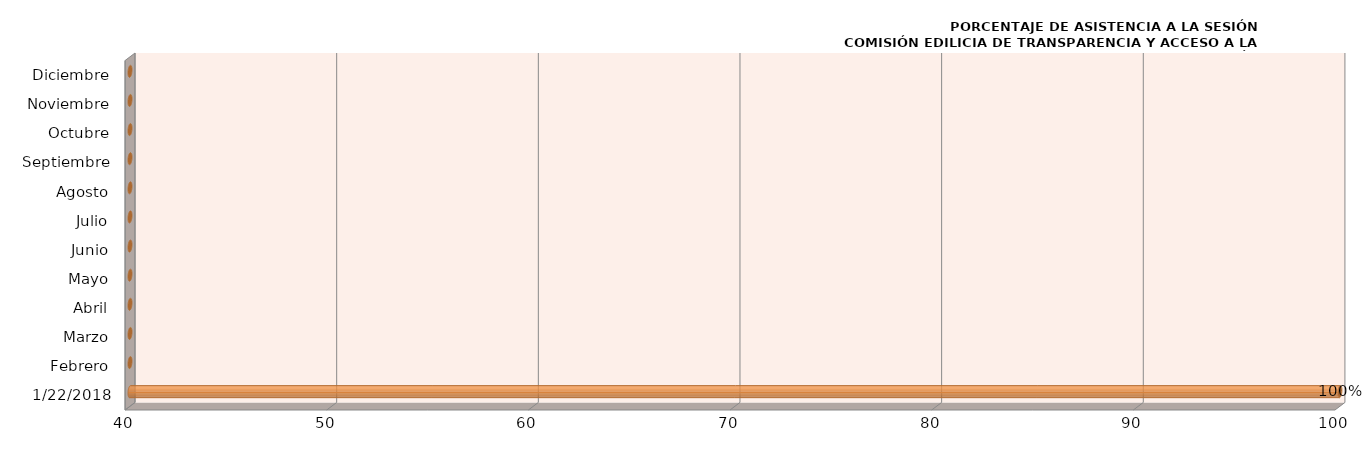
| Category | Series 0 |
|---|---|
| 22/01/2018 | 100 |
| Febrero | 0 |
| Marzo | 0 |
| Abril | 0 |
| Mayo | 0 |
| Junio | 0 |
| Julio | 0 |
| Agosto | 0 |
| Septiembre | 0 |
| Octubre | 0 |
| Noviembre | 0 |
| Diciembre | 0 |